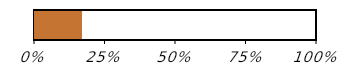
| Category | Purchasing Progress (1 of 6) |
|---|---|
| Koupené | 0.167 |